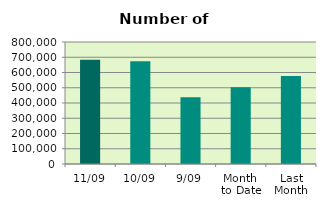
| Category | Series 0 |
|---|---|
| 11/09 | 684322 |
| 10/09 | 674578 |
| 9/09 | 437080 |
| Month 
to Date | 503013.5 |
| Last
Month | 576518.909 |